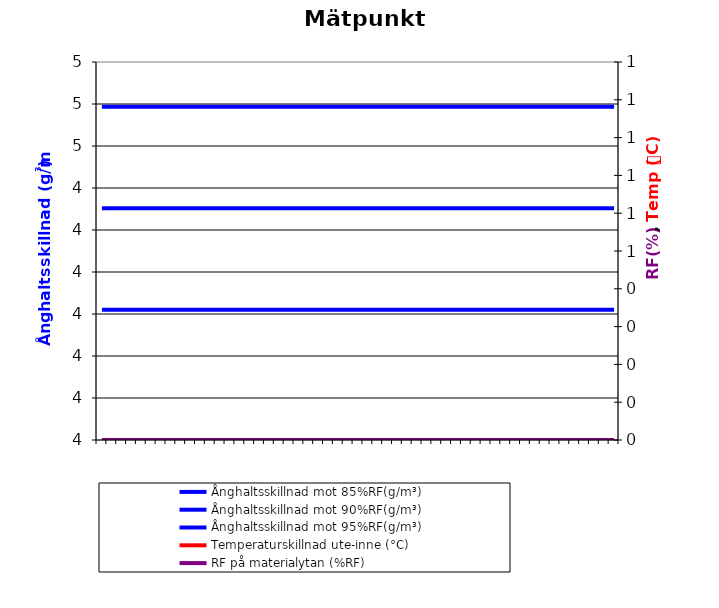
| Category | Ånghaltsskillnad mot 85%RF(g/m³) | Ånghaltsskillnad mot 90%RF(g/m³) | Ånghaltsskillnad mot 95%RF(g/m³) |
|---|---|---|---|
|  | 4.11 | 4.352 | 4.593 |
|  | 4.11 | 4.352 | 4.593 |
|  | 4.11 | 4.352 | 4.593 |
|  | 4.11 | 4.352 | 4.593 |
|  | 4.11 | 4.352 | 4.593 |
|  | 4.11 | 4.352 | 4.593 |
|  | 4.11 | 4.352 | 4.593 |
|  | 4.11 | 4.352 | 4.593 |
|  | 4.11 | 4.352 | 4.593 |
|  | 4.11 | 4.352 | 4.593 |
|  | 4.11 | 4.352 | 4.593 |
|  | 4.11 | 4.352 | 4.593 |
|  | 4.11 | 4.352 | 4.593 |
|  | 4.11 | 4.352 | 4.593 |
|  | 4.11 | 4.352 | 4.593 |
|  | 4.11 | 4.352 | 4.593 |
|  | 4.11 | 4.352 | 4.593 |
|  | 4.11 | 4.352 | 4.593 |
|  | 4.11 | 4.352 | 4.593 |
|  | 4.11 | 4.352 | 4.593 |
|  | 4.11 | 4.352 | 4.593 |
|  | 4.11 | 4.352 | 4.593 |
|  | 4.11 | 4.352 | 4.593 |
|  | 4.11 | 4.352 | 4.593 |
|  | 4.11 | 4.352 | 4.593 |
|  | 4.11 | 4.352 | 4.593 |
|  | 4.11 | 4.352 | 4.593 |
|  | 4.11 | 4.352 | 4.593 |
|  | 4.11 | 4.352 | 4.593 |
|  | 4.11 | 4.352 | 4.593 |
|  | 4.11 | 4.352 | 4.593 |
|  | 4.11 | 4.352 | 4.593 |
|  | 4.11 | 4.352 | 4.593 |
|  | 4.11 | 4.352 | 4.593 |
|  | 4.11 | 4.352 | 4.593 |
|  | 4.11 | 4.352 | 4.593 |
|  | 4.11 | 4.352 | 4.593 |
|  | 4.11 | 4.352 | 4.593 |
|  | 4.11 | 4.352 | 4.593 |
|  | 4.11 | 4.352 | 4.593 |
|  | 4.11 | 4.352 | 4.593 |
|  | 4.11 | 4.352 | 4.593 |
|  | 4.11 | 4.352 | 4.593 |
|  | 4.11 | 4.352 | 4.593 |
|  | 4.11 | 4.352 | 4.593 |
|  | 4.11 | 4.352 | 4.593 |
|  | 4.11 | 4.352 | 4.593 |
|  | 4.11 | 4.352 | 4.593 |
|  | 4.11 | 4.352 | 4.593 |
|  | 4.11 | 4.352 | 4.593 |
|  | 4.11 | 4.352 | 4.593 |
|  | 4.11 | 4.352 | 4.593 |
|  | 4.11 | 4.352 | 4.593 |